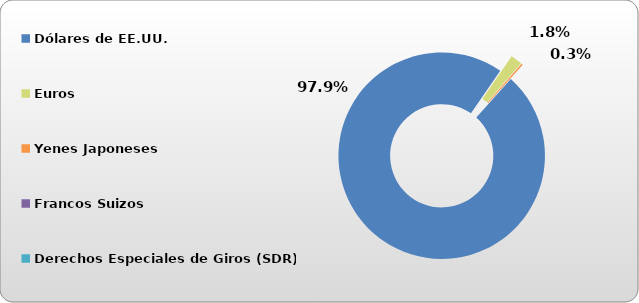
| Category | Dólares de EE.UU. |
|---|---|
| Dólares de EE.UU. | 45852.846 |
| Euros | 851.804 |
| Yenes Japoneses | 117.196 |
| Francos Suizos | 0 |
| Derechos Especiales de Giros (SDR) | 2.72 |